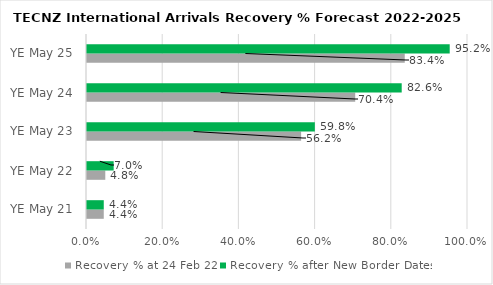
| Category | Recovery % at 24 Feb 22 | Recovery % after New Border Dates |
|---|---|---|
| YE May 21 | 0.044 | 0.044 |
| YE May 22 | 0.048 | 0.07 |
| YE May 23 | 0.562 | 0.598 |
| YE May 24 | 0.704 | 0.826 |
| YE May 25 | 0.834 | 0.952 |